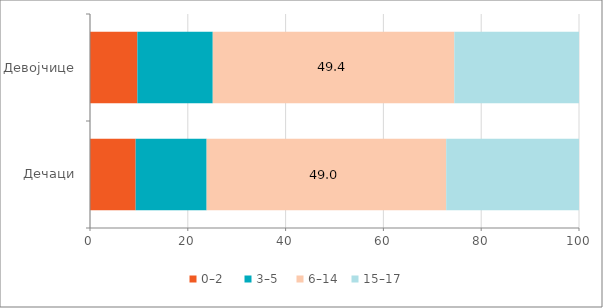
| Category | 0–2   | 3–5  | 6–14 | 15–17 |
|---|---|---|---|---|
| Дечаци | 9.337 | 14.515 | 48.991 | 27.158 |
| Девојчице | 9.685 | 15.419 | 49.392 | 25.504 |